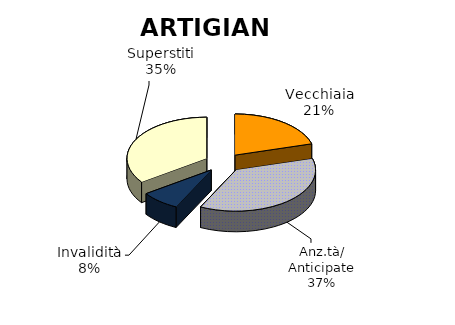
| Category | Series 0 |
|---|---|
| Vecchiaia | 14356 |
| Anz.tà/ Anticipate | 25652 |
| Invalidità | 5554 |
| Superstiti | 24285 |